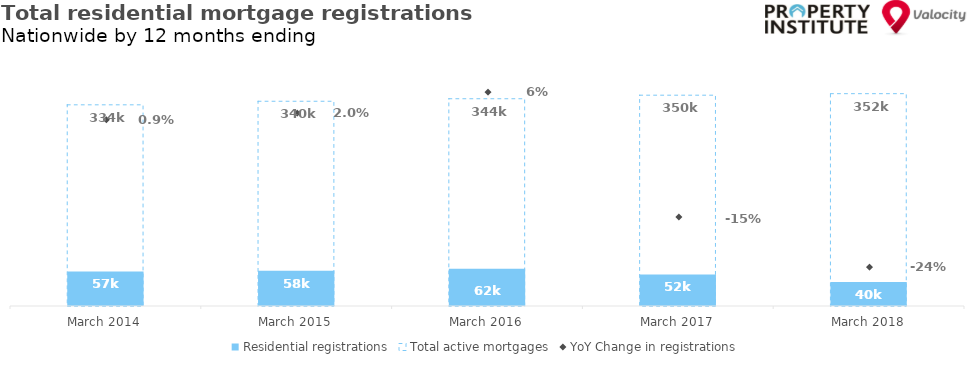
| Category | Residential registrations | Total active mortgages |
|---|---|---|
| 2014-03-01 | 57331 | 333912 |
| 2015-03-01 | 58485 | 339830 |
| 2016-03-01 | 61702 | 343984 |
| 2017-03-01 | 52310 | 349876 |
| 2018-03-01 | 39992 | 352421 |